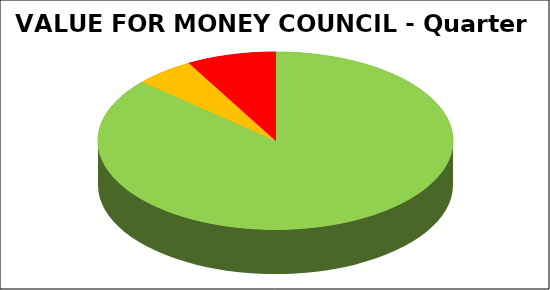
| Category | Series 0 |
|---|---|
| Green | 0.865 |
| Amber | 0.054 |
| Red | 0.081 |